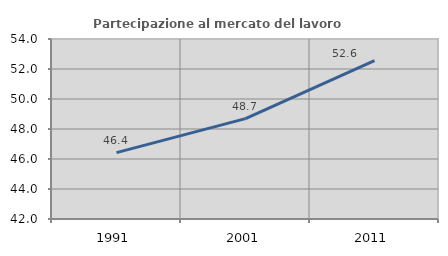
| Category | Partecipazione al mercato del lavoro  femminile |
|---|---|
| 1991.0 | 46.422 |
| 2001.0 | 48.689 |
| 2011.0 | 52.558 |